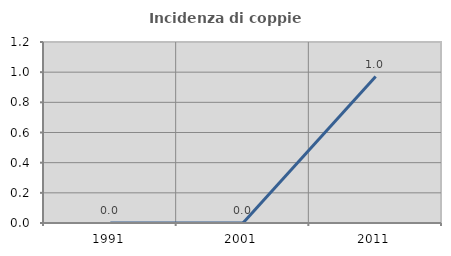
| Category | Incidenza di coppie miste |
|---|---|
| 1991.0 | 0 |
| 2001.0 | 0 |
| 2011.0 | 0.971 |